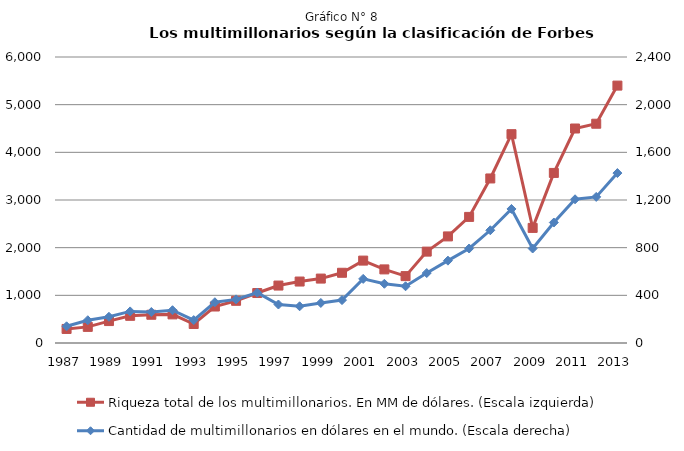
| Category | Riqueza total de los multimillonarios. En MM de dólares. (Escala izquierda) |
|---|---|
| 1987.0 | 295 |
| 1988.0 | 338 |
| 1989.0 | 459.9 |
| 1990.0 | 570.2 |
| 1991.0 | 592.4 |
| 1992.0 | 600.5 |
| 1993.0 | 398.6 |
| 1994.0 | 765.4 |
| 1995.0 | 885.1 |
| 1996.0 | 1048.5 |
| 1997.0 | 1205.287 |
| 1998.0 | 1289.373 |
| 1999.0 | 1351.46 |
| 2000.0 | 1473.28 |
| 2001.0 | 1728.6 |
| 2002.0 | 1544.2 |
| 2003.0 | 1403.3 |
| 2004.0 | 1917.2 |
| 2005.0 | 2236.2 |
| 2006.0 | 2645.5 |
| 2007.0 | 3452 |
| 2008.0 | 4381 |
| 2009.0 | 2414.7 |
| 2010.0 | 3567.8 |
| 2011.0 | 4500 |
| 2012.0 | 4600 |
| 2013.0 | 5400 |